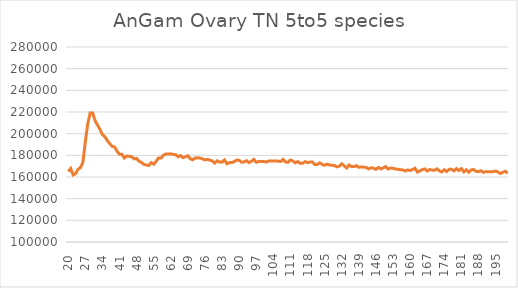
| Category | Series 1 |
|---|---|
| 20.0 | 165077 |
| 21.0 | 167892 |
| 22.0 | 161961 |
| 23.0 | 163058 |
| 24.0 | 167084 |
| 25.0 | 168656 |
| 26.0 | 173415 |
| 27.0 | 192309 |
| 28.0 | 209120 |
| 29.0 | 219189 |
| 30.0 | 219131 |
| 31.0 | 211970 |
| 32.0 | 207967 |
| 33.0 | 203963 |
| 34.0 | 199150 |
| 35.0 | 197133 |
| 36.0 | 193611 |
| 37.0 | 190789 |
| 38.0 | 188265 |
| 39.0 | 187693 |
| 40.0 | 183709 |
| 41.0 | 181047 |
| 42.0 | 180951 |
| 43.0 | 177588 |
| 44.0 | 179390 |
| 45.0 | 179022 |
| 46.0 | 178742 |
| 47.0 | 176679 |
| 48.0 | 177136 |
| 49.0 | 174557 |
| 50.0 | 173407 |
| 51.0 | 171663 |
| 52.0 | 171086 |
| 53.0 | 170595 |
| 54.0 | 173256 |
| 55.0 | 171758 |
| 56.0 | 174526 |
| 57.0 | 177564 |
| 58.0 | 177505 |
| 59.0 | 180113 |
| 60.0 | 181228 |
| 61.0 | 181169 |
| 62.0 | 181415 |
| 63.0 | 180846 |
| 64.0 | 180563 |
| 65.0 | 178619 |
| 66.0 | 179848 |
| 67.0 | 177839 |
| 68.0 | 178670 |
| 69.0 | 179562 |
| 70.0 | 176831 |
| 71.0 | 175919 |
| 72.0 | 177617 |
| 73.0 | 177666 |
| 74.0 | 177453 |
| 75.0 | 176712 |
| 76.0 | 175760 |
| 77.0 | 176401 |
| 78.0 | 175523 |
| 79.0 | 174776 |
| 80.0 | 172874 |
| 81.0 | 174954 |
| 82.0 | 173735 |
| 83.0 | 173727 |
| 84.0 | 175766 |
| 85.0 | 172209 |
| 86.0 | 173292 |
| 87.0 | 173343 |
| 88.0 | 174185 |
| 89.0 | 175725 |
| 90.0 | 175338 |
| 91.0 | 173544 |
| 92.0 | 173937 |
| 93.0 | 175108 |
| 94.0 | 173269 |
| 95.0 | 174488 |
| 96.0 | 176270 |
| 97.0 | 173596 |
| 98.0 | 174366 |
| 99.0 | 174419 |
| 100.0 | 174348 |
| 101.0 | 173817 |
| 102.0 | 174753 |
| 103.0 | 174714 |
| 104.0 | 174758 |
| 105.0 | 174899 |
| 106.0 | 174578 |
| 107.0 | 174348 |
| 108.0 | 176331 |
| 109.0 | 173769 |
| 110.0 | 173669 |
| 111.0 | 175717 |
| 112.0 | 174746 |
| 113.0 | 173123 |
| 114.0 | 174250 |
| 115.0 | 172683 |
| 116.0 | 172591 |
| 117.0 | 174261 |
| 118.0 | 173191 |
| 119.0 | 173797 |
| 120.0 | 173832 |
| 121.0 | 171499 |
| 122.0 | 171538 |
| 123.0 | 173155 |
| 124.0 | 171528 |
| 125.0 | 170876 |
| 126.0 | 171868 |
| 127.0 | 171074 |
| 128.0 | 170804 |
| 129.0 | 170680 |
| 130.0 | 169353 |
| 131.0 | 169981 |
| 132.0 | 172218 |
| 133.0 | 170274 |
| 134.0 | 168315 |
| 135.0 | 171093 |
| 136.0 | 169571 |
| 137.0 | 169646 |
| 138.0 | 170418 |
| 139.0 | 168922 |
| 140.0 | 169337 |
| 141.0 | 169103 |
| 142.0 | 168796 |
| 143.0 | 167442 |
| 144.0 | 168532 |
| 145.0 | 168136 |
| 146.0 | 166959 |
| 147.0 | 168854 |
| 148.0 | 167391 |
| 149.0 | 168402 |
| 150.0 | 169648 |
| 151.0 | 167321 |
| 152.0 | 168231 |
| 153.0 | 168149 |
| 154.0 | 167361 |
| 155.0 | 167172 |
| 156.0 | 166631 |
| 157.0 | 166570 |
| 158.0 | 165505 |
| 159.0 | 166503 |
| 160.0 | 165939 |
| 161.0 | 166903 |
| 162.0 | 168091 |
| 163.0 | 164518 |
| 164.0 | 165671 |
| 165.0 | 166746 |
| 166.0 | 167429 |
| 167.0 | 165539 |
| 168.0 | 166876 |
| 169.0 | 166366 |
| 170.0 | 166252 |
| 171.0 | 167511 |
| 172.0 | 165610 |
| 173.0 | 164698 |
| 174.0 | 166700 |
| 175.0 | 165031 |
| 176.0 | 167127 |
| 177.0 | 167116 |
| 178.0 | 165707 |
| 179.0 | 167726 |
| 180.0 | 165979 |
| 181.0 | 167786 |
| 182.0 | 164737 |
| 183.0 | 166710 |
| 184.0 | 164443 |
| 185.0 | 166496 |
| 186.0 | 166884 |
| 187.0 | 165248 |
| 188.0 | 164923 |
| 189.0 | 165801 |
| 190.0 | 164315 |
| 191.0 | 164976 |
| 192.0 | 164907 |
| 193.0 | 164737 |
| 194.0 | 164994 |
| 195.0 | 165454 |
| 196.0 | 164530 |
| 197.0 | 163295 |
| 198.0 | 164399 |
| 199.0 | 165264 |
| 200.0 | 163491 |